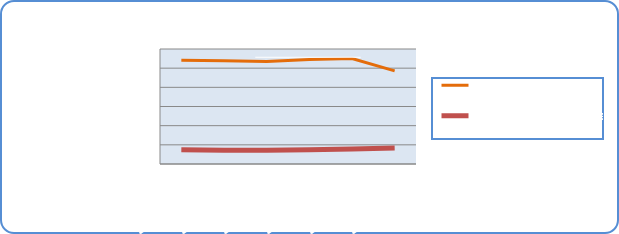
| Category | Motorin Türleri | Benzin Türleri |
|---|---|---|
| 5/6/19 | 54158953.584 | 7374751.299 |
| 5/7/19 | 53865199.736 | 7115227.294 |
| 5/8/19 | 53433157.202 | 7181397.609 |
| 5/9/19 | 54556288.972 | 7445382.081 |
| 5/10/19 | 55012082.001 | 7834347.752 |
| 5/11/19 | 48605234.902 | 8357300.529 |